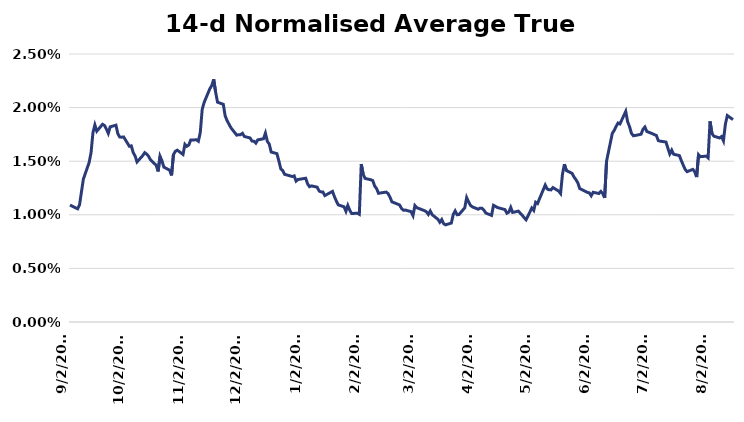
| Category | Series 0 |
|---|---|
| 9/2/16 | 0.011 |
| 9/6/16 | 0.011 |
| 9/7/16 | 0.011 |
| 9/8/16 | 0.012 |
| 9/9/16 | 0.013 |
| 9/12/16 | 0.015 |
| 9/13/16 | 0.016 |
| 9/14/16 | 0.018 |
| 9/15/16 | 0.018 |
| 9/16/16 | 0.018 |
| 9/19/16 | 0.018 |
| 9/20/16 | 0.018 |
| 9/21/16 | 0.018 |
| 9/22/16 | 0.018 |
| 9/23/16 | 0.018 |
| 9/26/16 | 0.018 |
| 9/27/16 | 0.018 |
| 9/28/16 | 0.017 |
| 9/29/16 | 0.017 |
| 9/30/16 | 0.017 |
| 10/3/16 | 0.016 |
| 10/4/16 | 0.016 |
| 10/5/16 | 0.016 |
| 10/6/16 | 0.015 |
| 10/7/16 | 0.015 |
| 10/10/16 | 0.016 |
| 10/11/16 | 0.016 |
| 10/12/16 | 0.016 |
| 10/13/16 | 0.015 |
| 10/14/16 | 0.015 |
| 10/17/16 | 0.015 |
| 10/18/16 | 0.014 |
| 10/19/16 | 0.015 |
| 10/20/16 | 0.015 |
| 10/21/16 | 0.014 |
| 10/24/16 | 0.014 |
| 10/25/16 | 0.014 |
| 10/26/16 | 0.016 |
| 10/27/16 | 0.016 |
| 10/28/16 | 0.016 |
| 10/31/16 | 0.016 |
| 11/1/16 | 0.017 |
| 11/2/16 | 0.016 |
| 11/3/16 | 0.017 |
| 11/4/16 | 0.017 |
| 11/7/16 | 0.017 |
| 11/8/16 | 0.017 |
| 11/9/16 | 0.018 |
| 11/10/16 | 0.02 |
| 11/11/16 | 0.02 |
| 11/14/16 | 0.022 |
| 11/15/16 | 0.022 |
| 11/16/16 | 0.023 |
| 11/17/16 | 0.021 |
| 11/18/16 | 0.021 |
| 11/21/16 | 0.02 |
| 11/22/16 | 0.019 |
| 11/23/16 | 0.019 |
| 11/25/16 | 0.018 |
| 11/28/16 | 0.017 |
| 11/29/16 | 0.017 |
| 11/30/16 | 0.017 |
| 12/1/16 | 0.018 |
| 12/2/16 | 0.017 |
| 12/5/16 | 0.017 |
| 12/6/16 | 0.017 |
| 12/7/16 | 0.017 |
| 12/8/16 | 0.017 |
| 12/9/16 | 0.017 |
| 12/12/16 | 0.017 |
| 12/13/16 | 0.018 |
| 12/14/16 | 0.017 |
| 12/15/16 | 0.017 |
| 12/16/16 | 0.016 |
| 12/19/16 | 0.016 |
| 12/20/16 | 0.015 |
| 12/21/16 | 0.014 |
| 12/22/16 | 0.014 |
| 12/23/16 | 0.014 |
| 12/27/16 | 0.014 |
| 12/28/16 | 0.014 |
| 12/29/16 | 0.013 |
| 12/30/16 | 0.013 |
| 1/3/17 | 0.013 |
| 1/4/17 | 0.013 |
| 1/5/17 | 0.013 |
| 1/6/17 | 0.013 |
| 1/9/17 | 0.013 |
| 1/10/17 | 0.012 |
| 1/11/17 | 0.012 |
| 1/12/17 | 0.012 |
| 1/13/17 | 0.012 |
| 1/17/17 | 0.012 |
| 1/18/17 | 0.012 |
| 1/19/17 | 0.011 |
| 1/20/17 | 0.011 |
| 1/23/17 | 0.011 |
| 1/24/17 | 0.01 |
| 1/25/17 | 0.011 |
| 1/26/17 | 0.01 |
| 1/27/17 | 0.01 |
| 1/30/17 | 0.01 |
| 1/31/17 | 0.01 |
| 2/1/17 | 0.015 |
| 2/2/17 | 0.014 |
| 2/3/17 | 0.013 |
| 2/6/17 | 0.013 |
| 2/7/17 | 0.013 |
| 2/8/17 | 0.013 |
| 2/9/17 | 0.012 |
| 2/10/17 | 0.012 |
| 2/13/17 | 0.012 |
| 2/14/17 | 0.012 |
| 2/15/17 | 0.012 |
| 2/16/17 | 0.012 |
| 2/17/17 | 0.011 |
| 2/21/17 | 0.011 |
| 2/22/17 | 0.011 |
| 2/23/17 | 0.01 |
| 2/24/17 | 0.01 |
| 2/27/17 | 0.01 |
| 2/28/17 | 0.01 |
| 3/1/17 | 0.011 |
| 3/2/17 | 0.011 |
| 3/3/17 | 0.011 |
| 3/6/17 | 0.01 |
| 3/7/17 | 0.01 |
| 3/8/17 | 0.01 |
| 3/9/17 | 0.01 |
| 3/10/17 | 0.01 |
| 3/13/17 | 0.01 |
| 3/14/17 | 0.009 |
| 3/15/17 | 0.01 |
| 3/16/17 | 0.009 |
| 3/17/17 | 0.009 |
| 3/20/17 | 0.009 |
| 3/21/17 | 0.01 |
| 3/22/17 | 0.01 |
| 3/23/17 | 0.01 |
| 3/24/17 | 0.01 |
| 3/27/17 | 0.011 |
| 3/28/17 | 0.012 |
| 3/29/17 | 0.011 |
| 3/30/17 | 0.011 |
| 3/31/17 | 0.011 |
| 4/3/17 | 0.011 |
| 4/4/17 | 0.011 |
| 4/5/17 | 0.011 |
| 4/6/17 | 0.01 |
| 4/7/17 | 0.01 |
| 4/10/17 | 0.01 |
| 4/11/17 | 0.011 |
| 4/12/17 | 0.011 |
| 4/13/17 | 0.011 |
| 4/17/17 | 0.01 |
| 4/18/17 | 0.01 |
| 4/19/17 | 0.01 |
| 4/20/17 | 0.011 |
| 4/21/17 | 0.01 |
| 4/24/17 | 0.01 |
| 4/25/17 | 0.01 |
| 4/26/17 | 0.01 |
| 4/27/17 | 0.01 |
| 4/28/17 | 0.01 |
| 5/1/17 | 0.011 |
| 5/2/17 | 0.01 |
| 5/3/17 | 0.011 |
| 5/4/17 | 0.011 |
| 5/5/17 | 0.011 |
| 5/8/17 | 0.013 |
| 5/9/17 | 0.012 |
| 5/10/17 | 0.012 |
| 5/11/17 | 0.012 |
| 5/12/17 | 0.013 |
| 5/15/17 | 0.012 |
| 5/16/17 | 0.012 |
| 5/17/17 | 0.014 |
| 5/18/17 | 0.015 |
| 5/19/17 | 0.014 |
| 5/22/17 | 0.014 |
| 5/23/17 | 0.014 |
| 5/24/17 | 0.013 |
| 5/25/17 | 0.013 |
| 5/26/17 | 0.012 |
| 5/30/17 | 0.012 |
| 5/31/17 | 0.012 |
| 6/1/17 | 0.012 |
| 6/2/17 | 0.012 |
| 6/5/17 | 0.012 |
| 6/6/17 | 0.012 |
| 6/7/17 | 0.012 |
| 6/8/17 | 0.012 |
| 6/9/17 | 0.015 |
| 6/12/17 | 0.018 |
| 6/13/17 | 0.018 |
| 6/14/17 | 0.018 |
| 6/15/17 | 0.019 |
| 6/16/17 | 0.018 |
| 6/19/17 | 0.02 |
| 6/20/17 | 0.019 |
| 6/21/17 | 0.018 |
| 6/22/17 | 0.018 |
| 6/23/17 | 0.017 |
| 6/26/17 | 0.017 |
| 6/27/17 | 0.018 |
| 6/28/17 | 0.018 |
| 6/29/17 | 0.018 |
| 6/30/17 | 0.018 |
| 7/3/17 | 0.018 |
| 7/5/17 | 0.017 |
| 7/6/17 | 0.017 |
| 7/7/17 | 0.017 |
| 7/10/17 | 0.017 |
| 7/11/17 | 0.016 |
| 7/12/17 | 0.016 |
| 7/13/17 | 0.016 |
| 7/14/17 | 0.016 |
| 7/17/17 | 0.016 |
| 7/18/17 | 0.015 |
| 7/19/17 | 0.015 |
| 7/20/17 | 0.014 |
| 7/21/17 | 0.014 |
| 7/24/17 | 0.014 |
| 7/25/17 | 0.014 |
| 7/26/17 | 0.014 |
| 7/27/17 | 0.016 |
| 7/28/17 | 0.015 |
| 7/31/17 | 0.015 |
| 8/1/17 | 0.015 |
| 8/2/17 | 0.019 |
| 8/3/17 | 0.018 |
| 8/4/17 | 0.017 |
| 8/7/17 | 0.017 |
| 8/8/17 | 0.017 |
| 8/9/17 | 0.017 |
| 8/10/17 | 0.018 |
| 8/11/17 | 0.019 |
| 8/14/17 | 0.019 |